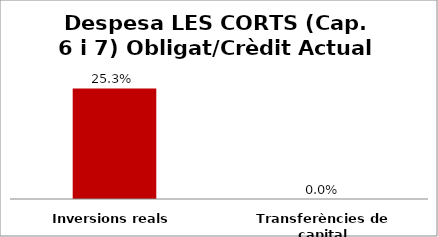
| Category | Series 0 |
|---|---|
| Inversions reals | 0.253 |
| Transferències de capital | 0 |